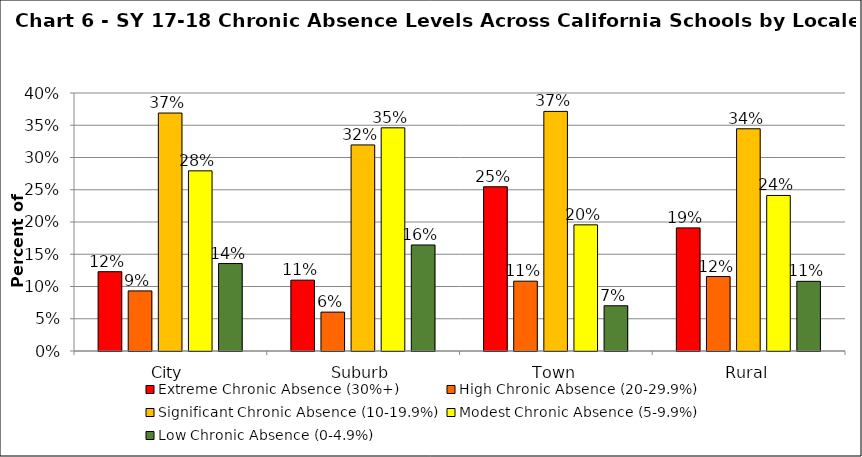
| Category | Extreme Chronic Absence (30%+) | High Chronic Absence (20-29.9%) | Significant Chronic Absence (10-19.9%) | Modest Chronic Absence (5-9.9%) | Low Chronic Absence (0-4.9%) |
|---|---|---|---|---|---|
| 0 | 0.123 | 0.093 | 0.369 | 0.279 | 0.136 |
| 1 | 0.11 | 0.06 | 0.319 | 0.346 | 0.164 |
| 2 | 0.255 | 0.108 | 0.371 | 0.196 | 0.07 |
| 3 | 0.191 | 0.115 | 0.345 | 0.241 | 0.108 |